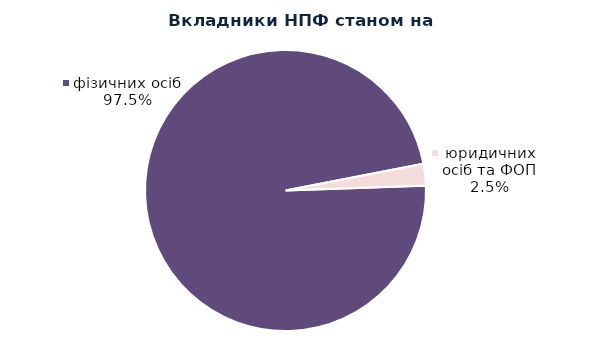
| Category | Series 0 |
|---|---|
| юридичних осіб та ФОП | 2098 |
| фізичних осіб | 81611 |